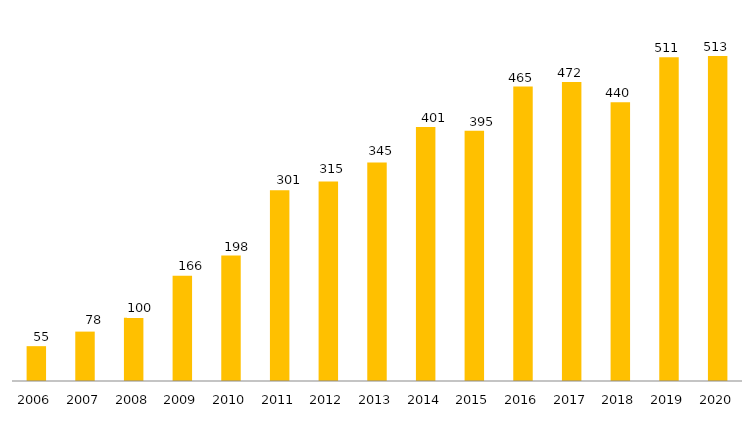
| Category | Programa |
|---|---|
| 2006.0 | 55 |
| 2007.0 | 78 |
| 2008.0 | 100 |
| 2009.0 | 166 |
| 2010.0 | 198 |
| 2011.0 | 301 |
| 2012.0 | 315 |
| 2013.0 | 345 |
| 2014.0 | 401 |
| 2015.0 | 395 |
| 2016.0 | 465 |
| 2017.0 | 472 |
| 2018.0 | 440 |
| 2019.0 | 511 |
| 2020.0 | 513 |